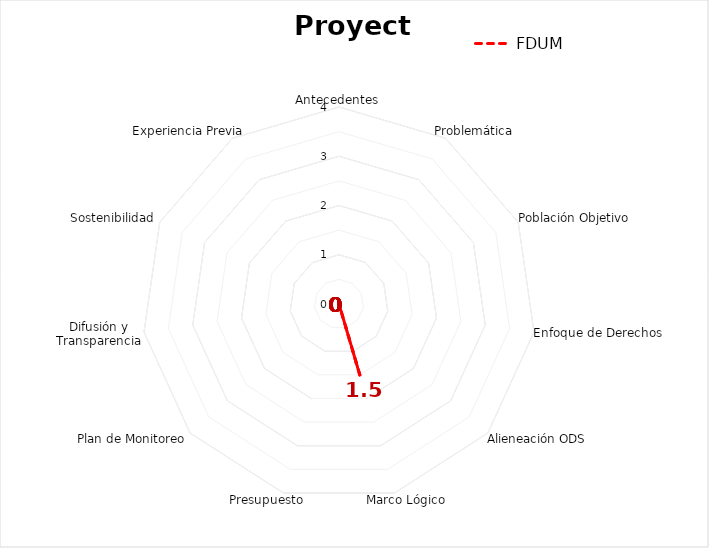
| Category | FDUM |
|---|---|
| Antecedentes | 0 |
| Problemática | 0 |
| Población Objetivo | 0 |
| Enfoque de Derechos | 0 |
| Alieneación ODS | 0 |
| Marco Lógico  | 1.5 |
| Presupuesto | 0 |
| Plan de Monitoreo | 0 |
| Difusión y Transparencia | 0 |
| Sostenibilidad | 0 |
| Experiencia Previa | 0 |